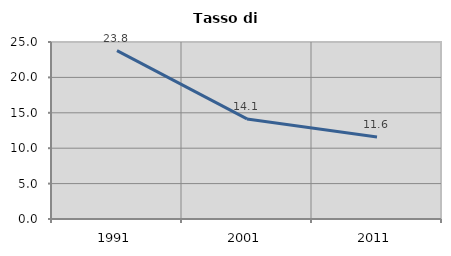
| Category | Tasso di disoccupazione   |
|---|---|
| 1991.0 | 23.792 |
| 2001.0 | 14.133 |
| 2011.0 | 11.576 |